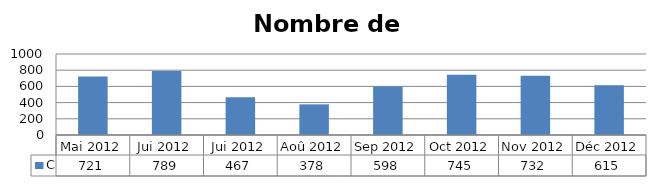
| Category | C |
|---|---|
| Mai 2012 | 721 |
| Jui 2012 | 789 |
| Jui 2012 | 467 |
| Aoû 2012 | 378 |
| Sep 2012 | 598 |
| Oct 2012 | 745 |
| Nov 2012 | 732 |
| Déc 2012 | 615 |